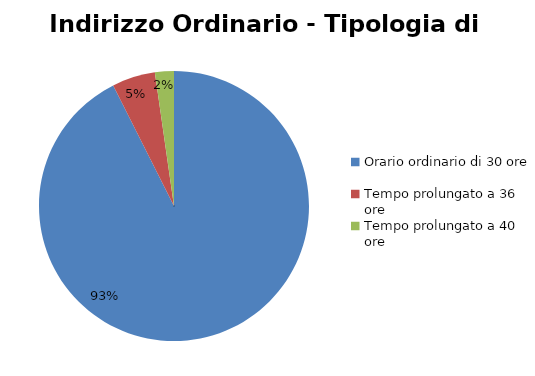
| Category | Series 0 |
|---|---|
| Orario ordinario di 30 ore | 32391 |
| Tempo prolungato a 36 ore | 1808 |
| Tempo prolungato a 40 ore | 794 |